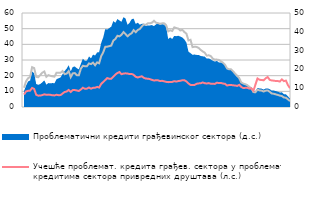
| Category | Учешће проблемат. кредита грађев. сектора у укупним
кредитима грађев. сектора (л.с.) | Учешће проблемат. кредита грађев. сектора у проблемат. 
кредитима сектора привредних друштава (л.с.) |
|---|---|---|
|  | 12.298 | 7.953 |
|  | 16.411 | 9.964 |
|  | 18.367 | 10.307 |
|  | 19.169 | 10.429 |
| 6
2009. | 25.433 | 12.171 |
|  | 24.835 | 11.492 |
|  | 19.256 | 7.802 |
|  | 18.981 | 7.244 |
|  | 20.435 | 7.307 |
|  | 21.895 | 7.598 |
| 12 | 22.645 | 8.082 |
| 1
2010. | 19.291 | 7.791 |
|  | 20.325 | 7.901 |
|  | 19.909 | 7.77 |
|  | 19.587 | 7.459 |
|  | 19.384 | 7.403 |
| 6
2010. | 21.841 | 7.803 |
|  | 21.9 | 7.569 |
|  | 21.893 | 7.585 |
|  | 22.897 | 8.602 |
|  | 20.957 | 9.578 |
|  | 21.316 | 9.883 |
| 12 | 22.951 | 10.902 |
| 1
2011. | 19.044 | 9.605 |
|  | 21.464 | 10.773 |
|  | 21.647 | 10.817 |
|  | 20.33 | 10.537 |
|  | 20.222 | 10.213 |
| 6
2011. | 24.486 | 11.167 |
|  | 26.307 | 12.286 |
|  | 26.025 | 11.63 |
|  | 26.069 | 11.734 |
|  | 27.804 | 12.439 |
|  | 27.388 | 11.715 |
| 12 | 28.322 | 12.235 |
| 1
2012. | 26.666 | 12.303 |
|  | 28.495 | 12.822 |
|  | 27.903 | 12.414 |
|  | 32.444 | 14.729 |
|  | 34.841 | 15.967 |
| 6
2012. | 38.393 | 17.166 |
|  | 38.504 | 18.425 |
|  | 38.824 | 18.02 |
|  | 39.218 | 18.083 |
|  | 42.401 | 19.329 |
|  | 43.421 | 20.716 |
| 12 | 45.464 | 21.691 |
| 1
2013. | 45.077 | 22.315 |
|  | 46.093 | 20.946 |
|  | 47.827 | 21.339 |
|  | 46.562 | 21.484 |
|  | 45.129 | 21.378 |
| 6
2013. | 46.309 | 20.985 |
|  | 47.078 | 21.124 |
|  | 49.061 | 20.535 |
|  | 47.719 | 19.305 |
|  | 49.11 | 18.858 |
|  | 49.753 | 19.235 |
| 12 | 51.351 | 19.613 |
| 1
2014. | 52.672 | 18.623 |
|  | 52.459 | 18.13 |
|  | 53.449 | 18.092 |
|  | 53.4 | 17.773 |
|  | 53.814 | 17.325 |
| 6
2014. | 55.031 | 16.909 |
|  | 53.856 | 17.062 |
|  | 53.532 | 17.007 |
|  | 53.153 | 16.589 |
|  | 53.392 | 16.713 |
|  | 53.438 | 16.409 |
| 12 | 52.2 | 16.064 |
| 1
2015. | 48.26 | 15.867 |
|  | 48.994 | 15.97 |
|  | 48.54 | 16.023 |
|  | 50.819 | 16.5 |
|  | 50.398 | 16.224 |
| 6
2015. | 50.034 | 16.529 |
|  | 48.852 | 16.755 |
|  | 49.2 | 17.08 |
|  | 47.851 | 17.074 |
|  | 46.8 | 16.302 |
|  | 42.497 | 15.02 |
| 12 | 42.897 | 14.115 |
| 1
2016. | 38.217 | 14.005 |
|  | 38.481 | 14.086 |
|  | 38.357 | 14.828 |
|  | 37.683 | 15.073 |
|  | 36.469 | 15.098 |
| 6
2016. | 35.485 | 15.671 |
|  | 34.686 | 15.189 |
|  | 32.812 | 15.006 |
|  | 33.031 | 15.257 |
|  | 32.472 | 14.824 |
|  | 30.854 | 14.772 |
| 12 | 30.237 | 14.756 |
| 1
2017. | 30.25 | 15.536 |
|  | 30.017 | 15.275 |
|  | 29.166 | 15.356 |
|  | 28.279 | 14.979 |
|  | 26.947 | 14.796 |
| 6
2017. | 24.631 | 13.709 |
|  | 24.106 | 14.046 |
|  | 24.082 | 14.052 |
|  | 22.783 | 13.837 |
|  | 21.226 | 13.72 |
|  | 19.97 | 13.447 |
| 12 | 18.452 | 14.114 |
| 1
2018. | 15.625 | 12.822 |
|  | 14.94 | 12.128 |
|  | 14.54 | 12.227 |
|  | 13.92 | 12.239 |
|  | 12.85 | 11.727 |
| 6
2018. | 11.9 | 11.834 |
|  | 9.5 | 10.392 |
|  | 9.47 | 14.361 |
|  | 11.06 | 18.232 |
|  | 10.59 | 17.345 |
|  | 10.44 | 17.269 |
| 12 | 9.88 | 17.028 |
| 1
2019. | 10.41 | 18.313 |
|  | 10.579 | 19.133 |
|  | 9.755 | 17.365 |
|  | 8.609 | 16.93 |
|  | 8.463 | 16.813 |
| 6
2019. | 8.06 | 16.583 |
|  | 7.693 | 16.56 |
|  | 7.264 | 16.26 |
|  | 7.001 | 17.614 |
|  | 6.068 | 16.511 |
|  | 5.909 | 16.838 |
| 12 | 4.879 | 13.922 |